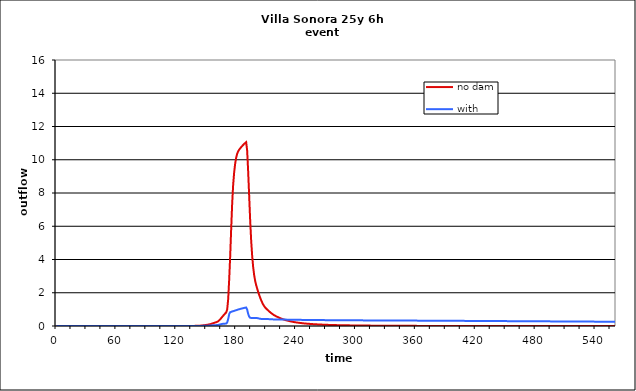
| Category | no dam | with dam |
|---|---|---|
| 0.0 | 0 | 0 |
| 1.0 | 0 | 0 |
| 2.0 | 0 | 0 |
| 3.0 | 0 | 0 |
| 4.0 | 0 | 0 |
| 5.0 | 0 | 0 |
| 6.0 | 0 | 0 |
| 7.0 | 0 | 0 |
| 8.0 | 0 | 0 |
| 9.0 | 0 | 0 |
| 10.0 | 0 | 0 |
| 11.0 | 0 | 0 |
| 12.0 | 0 | 0 |
| 13.0 | 0 | 0 |
| 14.0 | 0 | 0 |
| 15.0 | 0 | 0 |
| 16.0 | 0 | 0 |
| 17.0 | 0 | 0 |
| 18.0 | 0 | 0 |
| 19.0 | 0 | 0 |
| 20.0 | 0 | 0 |
| 21.0 | 0 | 0 |
| 22.0 | 0 | 0 |
| 23.0 | 0 | 0 |
| 24.0 | 0 | 0 |
| 25.0 | 0 | 0 |
| 26.0 | 0 | 0 |
| 27.0 | 0 | 0 |
| 28.0 | 0 | 0 |
| 29.0 | 0 | 0 |
| 30.0 | 0 | 0 |
| 31.0 | 0 | 0 |
| 32.0 | 0 | 0 |
| 33.0 | 0 | 0 |
| 34.0 | 0 | 0 |
| 35.0 | 0 | 0 |
| 36.0 | 0 | 0 |
| 37.0 | 0 | 0 |
| 38.0 | 0 | 0 |
| 39.0 | 0 | 0 |
| 40.0 | 0 | 0 |
| 41.0 | 0 | 0 |
| 42.0 | 0 | 0 |
| 43.0 | 0 | 0 |
| 44.0 | 0 | 0 |
| 45.0 | 0 | 0 |
| 46.0 | 0 | 0 |
| 47.0 | 0 | 0 |
| 48.0 | 0 | 0 |
| 49.0 | 0 | 0 |
| 50.0 | 0 | 0 |
| 51.0 | 0 | 0 |
| 52.0 | 0 | 0 |
| 53.0 | 0 | 0 |
| 54.0 | 0 | 0 |
| 55.0 | 0 | 0 |
| 56.0 | 0 | 0 |
| 57.0 | 0 | 0 |
| 58.0 | 0 | 0 |
| 59.0 | 0 | 0 |
| 60.0 | 0 | 0 |
| 61.0 | 0 | 0 |
| 62.0 | 0 | 0 |
| 63.0 | 0 | 0 |
| 64.0 | 0 | 0 |
| 65.0 | 0 | 0 |
| 66.0 | 0 | 0 |
| 67.0 | 0 | 0 |
| 68.0 | 0 | 0 |
| 69.0 | 0 | 0 |
| 70.0 | 0 | 0 |
| 71.0 | 0 | 0 |
| 72.0 | 0 | 0 |
| 73.0 | 0 | 0 |
| 74.0 | 0 | 0 |
| 75.0 | 0 | 0 |
| 76.0 | 0 | 0 |
| 77.0 | 0 | 0 |
| 78.0 | 0 | 0 |
| 79.0 | 0 | 0 |
| 80.0 | 0 | 0 |
| 81.0 | 0 | 0 |
| 82.0 | 0 | 0 |
| 83.0 | 0 | 0 |
| 84.0 | 0 | 0 |
| 85.0 | 0 | 0 |
| 86.0 | 0 | 0 |
| 87.0 | 0 | 0 |
| 88.0 | 0 | 0 |
| 89.0 | 0 | 0 |
| 90.0 | 0 | 0 |
| 91.0 | 0 | 0 |
| 92.0 | 0 | 0 |
| 93.0 | 0 | 0 |
| 94.0 | 0 | 0 |
| 95.0 | 0 | 0 |
| 96.0 | 0 | 0 |
| 97.0 | 0 | 0 |
| 98.0 | 0 | 0 |
| 99.0 | 0 | 0 |
| 100.0 | 0 | 0 |
| 101.0 | 0 | 0 |
| 102.0 | 0 | 0 |
| 103.0 | 0 | 0 |
| 104.0 | 0 | 0 |
| 105.0 | 0 | 0 |
| 106.0 | 0 | 0 |
| 107.0 | 0 | 0 |
| 108.0 | 0 | 0 |
| 109.0 | 0 | 0 |
| 110.0 | 0 | 0 |
| 111.0 | 0 | 0 |
| 112.0 | 0 | 0 |
| 113.0 | 0 | 0 |
| 114.0 | 0 | 0 |
| 115.0 | 0 | 0 |
| 116.0 | 0 | 0 |
| 117.0 | 0 | 0 |
| 118.0 | 0 | 0 |
| 119.0 | 0 | 0 |
| 120.0 | 0 | 0 |
| 121.0 | 0 | 0 |
| 122.0 | 0 | 0 |
| 123.0 | 0 | 0 |
| 124.0 | 0 | 0 |
| 125.0 | 0 | 0 |
| 126.0 | 0 | 0 |
| 127.0 | 0 | 0 |
| 128.0 | 0 | 0 |
| 129.0 | 0 | 0 |
| 130.0 | 0 | 0 |
| 131.0 | 0 | 0 |
| 132.0 | 0 | 0 |
| 133.0 | 0 | 0 |
| 134.0 | 0 | 0 |
| 135.0 | 0 | 0 |
| 136.0 | 0 | 0 |
| 137.0 | 0.001 | 0 |
| 138.0 | 0.006 | 0.001 |
| 139.0 | 0.009 | 0.001 |
| 140.0 | 0.01 | 0.001 |
| 141.0 | 0.012 | 0.002 |
| 142.0 | 0.014 | 0.002 |
| 143.0 | 0.017 | 0.003 |
| 144.0 | 0.021 | 0.004 |
| 145.0 | 0.026 | 0.005 |
| 146.0 | 0.032 | 0.007 |
| 147.0 | 0.04 | 0.009 |
| 148.0 | 0.048 | 0.012 |
| 149.0 | 0.057 | 0.014 |
| 150.0 | 0.065 | 0.016 |
| 151.0 | 0.073 | 0.018 |
| 152.0 | 0.083 | 0.02 |
| 153.0 | 0.095 | 0.024 |
| 154.0 | 0.11 | 0.028 |
| 155.0 | 0.13 | 0.033 |
| 156.0 | 0.151 | 0.037 |
| 157.0 | 0.171 | 0.042 |
| 158.0 | 0.19 | 0.046 |
| 159.0 | 0.209 | 0.049 |
| 160.0 | 0.227 | 0.052 |
| 161.0 | 0.25 | 0.056 |
| 162.0 | 0.283 | 0.066 |
| 163.0 | 0.331 | 0.079 |
| 164.0 | 0.399 | 0.096 |
| 165.0 | 0.474 | 0.113 |
| 166.0 | 0.547 | 0.126 |
| 167.0 | 0.619 | 0.134 |
| 168.0 | 0.689 | 0.139 |
| 169.0 | 0.756 | 0.143 |
| 170.0 | 0.818 | 0.146 |
| 171.0 | 0.994 | 0.213 |
| 172.0 | 1.619 | 0.423 |
| 173.0 | 2.797 | 0.709 |
| 174.0 | 4.209 | 0.829 |
| 175.0 | 5.847 | 0.855 |
| 176.0 | 7.383 | 0.874 |
| 177.0 | 8.508 | 0.892 |
| 178.0 | 9.254 | 0.911 |
| 179.0 | 9.768 | 0.93 |
| 180.0 | 10.128 | 0.951 |
| 181.0 | 10.358 | 0.971 |
| 182.0 | 10.506 | 0.991 |
| 183.0 | 10.605 | 1.009 |
| 184.0 | 10.684 | 1.026 |
| 185.0 | 10.755 | 1.042 |
| 186.0 | 10.824 | 1.058 |
| 187.0 | 10.891 | 1.073 |
| 188.0 | 10.953 | 1.087 |
| 189.0 | 11.009 | 1.1 |
| 190.0 | 11.056 | 1.113 |
| 191.0 | 10.547 | 0.988 |
| 192.0 | 9.304 | 0.736 |
| 193.0 | 7.849 | 0.565 |
| 194.0 | 6.383 | 0.496 |
| 195.0 | 5.162 | 0.477 |
| 196.0 | 4.237 | 0.476 |
| 197.0 | 3.555 | 0.479 |
| 198.0 | 3.07 | 0.483 |
| 199.0 | 2.72 | 0.486 |
| 200.0 | 2.462 | 0.488 |
| 201.0 | 2.256 | 0.483 |
| 202.0 | 2.059 | 0.465 |
| 203.0 | 1.877 | 0.446 |
| 204.0 | 1.71 | 0.432 |
| 205.0 | 1.557 | 0.425 |
| 206.0 | 1.419 | 0.422 |
| 207.0 | 1.299 | 0.422 |
| 208.0 | 1.198 | 0.423 |
| 209.0 | 1.116 | 0.423 |
| 210.0 | 1.05 | 0.424 |
| 211.0 | 0.993 | 0.423 |
| 212.0 | 0.937 | 0.417 |
| 213.0 | 0.882 | 0.41 |
| 214.0 | 0.829 | 0.405 |
| 215.0 | 0.779 | 0.401 |
| 216.0 | 0.733 | 0.399 |
| 217.0 | 0.69 | 0.398 |
| 218.0 | 0.651 | 0.398 |
| 219.0 | 0.616 | 0.398 |
| 220.0 | 0.585 | 0.398 |
| 221.0 | 0.557 | 0.398 |
| 222.0 | 0.529 | 0.395 |
| 223.0 | 0.502 | 0.392 |
| 224.0 | 0.474 | 0.389 |
| 225.0 | 0.449 | 0.387 |
| 226.0 | 0.425 | 0.385 |
| 227.0 | 0.402 | 0.384 |
| 228.0 | 0.382 | 0.384 |
| 229.0 | 0.364 | 0.384 |
| 230.0 | 0.347 | 0.384 |
| 231.0 | 0.331 | 0.383 |
| 232.0 | 0.316 | 0.382 |
| 233.0 | 0.302 | 0.38 |
| 234.0 | 0.287 | 0.378 |
| 235.0 | 0.273 | 0.377 |
| 236.0 | 0.26 | 0.376 |
| 237.0 | 0.247 | 0.375 |
| 238.0 | 0.236 | 0.374 |
| 239.0 | 0.226 | 0.374 |
| 240.0 | 0.217 | 0.374 |
| 241.0 | 0.209 | 0.373 |
| 242.0 | 0.2 | 0.372 |
| 243.0 | 0.193 | 0.371 |
| 244.0 | 0.185 | 0.37 |
| 245.0 | 0.177 | 0.369 |
| 246.0 | 0.169 | 0.368 |
| 247.0 | 0.162 | 0.367 |
| 248.0 | 0.156 | 0.366 |
| 249.0 | 0.15 | 0.366 |
| 250.0 | 0.145 | 0.365 |
| 251.0 | 0.14 | 0.365 |
| 252.0 | 0.135 | 0.364 |
| 253.0 | 0.13 | 0.363 |
| 254.0 | 0.126 | 0.362 |
| 255.0 | 0.121 | 0.362 |
| 256.0 | 0.117 | 0.361 |
| 257.0 | 0.112 | 0.36 |
| 258.0 | 0.108 | 0.36 |
| 259.0 | 0.105 | 0.359 |
| 260.0 | 0.101 | 0.359 |
| 261.0 | 0.098 | 0.358 |
| 262.0 | 0.095 | 0.358 |
| 263.0 | 0.092 | 0.357 |
| 264.0 | 0.089 | 0.356 |
| 265.0 | 0.086 | 0.355 |
| 266.0 | 0.083 | 0.355 |
| 267.0 | 0.08 | 0.354 |
| 268.0 | 0.078 | 0.354 |
| 269.0 | 0.075 | 0.353 |
| 270.0 | 0.073 | 0.353 |
| 271.0 | 0.07 | 0.352 |
| 272.0 | 0.068 | 0.352 |
| 273.0 | 0.066 | 0.351 |
| 274.0 | 0.064 | 0.35 |
| 275.0 | 0.062 | 0.35 |
| 276.0 | 0.06 | 0.349 |
| 277.0 | 0.058 | 0.349 |
| 278.0 | 0.057 | 0.349 |
| 279.0 | 0.055 | 0.348 |
| 280.0 | 0.053 | 0.348 |
| 281.0 | 0.052 | 0.347 |
| 282.0 | 0.05 | 0.347 |
| 283.0 | 0.049 | 0.347 |
| 284.0 | 0.048 | 0.346 |
| 285.0 | 0.047 | 0.346 |
| 286.0 | 0.046 | 0.345 |
| 287.0 | 0.044 | 0.345 |
| 288.0 | 0.043 | 0.345 |
| 289.0 | 0.042 | 0.344 |
| 290.0 | 0.041 | 0.344 |
| 291.0 | 0.04 | 0.344 |
| 292.0 | 0.039 | 0.343 |
| 293.0 | 0.038 | 0.343 |
| 294.0 | 0.037 | 0.342 |
| 295.0 | 0.036 | 0.342 |
| 296.0 | 0.036 | 0.342 |
| 297.0 | 0.035 | 0.341 |
| 298.0 | 0.034 | 0.341 |
| 299.0 | 0.033 | 0.341 |
| 300.0 | 0.032 | 0.34 |
| 301.0 | 0.031 | 0.34 |
| 302.0 | 0.03 | 0.34 |
| 303.0 | 0.03 | 0.339 |
| 304.0 | 0.029 | 0.339 |
| 305.0 | 0.028 | 0.339 |
| 306.0 | 0.027 | 0.339 |
| 307.0 | 0.027 | 0.338 |
| 308.0 | 0.026 | 0.338 |
| 309.0 | 0.025 | 0.338 |
| 310.0 | 0.025 | 0.337 |
| 311.0 | 0.024 | 0.337 |
| 312.0 | 0.024 | 0.337 |
| 313.0 | 0.023 | 0.337 |
| 314.0 | 0.023 | 0.336 |
| 315.0 | 0.022 | 0.336 |
| 316.0 | 0.022 | 0.336 |
| 317.0 | 0.021 | 0.336 |
| 318.0 | 0.021 | 0.335 |
| 319.0 | 0.02 | 0.335 |
| 320.0 | 0.02 | 0.335 |
| 321.0 | 0.019 | 0.334 |
| 322.0 | 0.019 | 0.334 |
| 323.0 | 0.019 | 0.334 |
| 324.0 | 0.018 | 0.334 |
| 325.0 | 0.018 | 0.333 |
| 326.0 | 0.017 | 0.333 |
| 327.0 | 0.017 | 0.333 |
| 328.0 | 0.017 | 0.333 |
| 329.0 | 0.016 | 0.332 |
| 330.0 | 0.016 | 0.332 |
| 331.0 | 0.016 | 0.332 |
| 332.0 | 0.015 | 0.331 |
| 333.0 | 0.015 | 0.331 |
| 334.0 | 0.014 | 0.331 |
| 335.0 | 0.014 | 0.331 |
| 336.0 | 0.014 | 0.33 |
| 337.0 | 0.013 | 0.33 |
| 338.0 | 0.013 | 0.33 |
| 339.0 | 0.013 | 0.33 |
| 340.0 | 0.013 | 0.329 |
| 341.0 | 0.012 | 0.329 |
| 342.0 | 0.012 | 0.329 |
| 343.0 | 0.012 | 0.328 |
| 344.0 | 0.011 | 0.328 |
| 345.0 | 0.011 | 0.328 |
| 346.0 | 0.011 | 0.328 |
| 347.0 | 0.011 | 0.327 |
| 348.0 | 0.01 | 0.327 |
| 349.0 | 0.01 | 0.327 |
| 350.0 | 0.01 | 0.326 |
| 351.0 | 0.01 | 0.326 |
| 352.0 | 0.009 | 0.326 |
| 353.0 | 0.009 | 0.326 |
| 354.0 | 0.009 | 0.325 |
| 355.0 | 0.009 | 0.325 |
| 356.0 | 0.008 | 0.325 |
| 357.0 | 0.008 | 0.324 |
| 358.0 | 0.008 | 0.324 |
| 359.0 | 0.008 | 0.324 |
| 360.0 | 0.008 | 0.324 |
| 361.0 | 0.007 | 0.323 |
| 362.0 | 0.007 | 0.323 |
| 363.0 | 0.007 | 0.323 |
| 364.0 | 0.007 | 0.322 |
| 365.0 | 0.007 | 0.322 |
| 366.0 | 0.006 | 0.322 |
| 367.0 | 0.006 | 0.322 |
| 368.0 | 0.006 | 0.321 |
| 369.0 | 0.006 | 0.321 |
| 370.0 | 0.006 | 0.321 |
| 371.0 | 0.006 | 0.32 |
| 372.0 | 0.005 | 0.32 |
| 373.0 | 0.005 | 0.32 |
| 374.0 | 0.005 | 0.32 |
| 375.0 | 0.004 | 0.319 |
| 376.0 | 0.004 | 0.319 |
| 377.0 | 0.004 | 0.319 |
| 378.0 | 0.004 | 0.318 |
| 379.0 | 0.003 | 0.318 |
| 380.0 | 0.003 | 0.318 |
| 381.0 | 0.003 | 0.318 |
| 382.0 | 0.002 | 0.317 |
| 383.0 | 0.002 | 0.317 |
| 384.0 | 0.002 | 0.317 |
| 385.0 | 0.002 | 0.316 |
| 386.0 | 0.001 | 0.316 |
| 387.0 | 0.001 | 0.316 |
| 388.0 | 0.001 | 0.315 |
| 389.0 | 0.001 | 0.315 |
| 390.0 | 0.001 | 0.315 |
| 391.0 | 0.001 | 0.314 |
| 392.0 | 0.001 | 0.314 |
| 393.0 | 0.001 | 0.314 |
| 394.0 | 0.001 | 0.313 |
| 395.0 | 0.001 | 0.313 |
| 396.0 | 0 | 0.313 |
| 397.0 | 0 | 0.312 |
| 398.0 | 0 | 0.312 |
| 399.0 | 0 | 0.312 |
| 400.0 | 0 | 0.311 |
| 401.0 | 0 | 0.311 |
| 402.0 | 0 | 0.31 |
| 403.0 | 0 | 0.31 |
| 404.0 | 0 | 0.31 |
| 405.0 | 0 | 0.309 |
| 406.0 | 0 | 0.309 |
| 407.0 | 0 | 0.309 |
| 408.0 | 0 | 0.308 |
| 409.0 | 0 | 0.308 |
| 410.0 | 0 | 0.308 |
| 411.0 | 0 | 0.307 |
| 412.0 | 0 | 0.307 |
| 413.0 | 0 | 0.307 |
| 414.0 | 0 | 0.306 |
| 415.0 | 0 | 0.306 |
| 416.0 | 0 | 0.306 |
| 417.0 | 0 | 0.305 |
| 418.0 | 0 | 0.305 |
| 419.0 | 0 | 0.304 |
| 420.0 | 0 | 0.304 |
| 421.0 | 0 | 0.304 |
| 422.0 | 0 | 0.303 |
| 423.0 | 0 | 0.303 |
| 424.0 | 0 | 0.303 |
| 425.0 | 0 | 0.302 |
| 426.0 | 0 | 0.302 |
| 427.0 | 0 | 0.302 |
| 428.0 | 0 | 0.301 |
| 429.0 | 0 | 0.301 |
| 430.0 | 0 | 0.301 |
| 431.0 | 0 | 0.3 |
| 432.0 | 0 | 0.3 |
| 433.0 | 0 | 0.3 |
| 434.0 | 0 | 0.299 |
| 435.0 | 0 | 0.299 |
| 436.0 | 0 | 0.299 |
| 437.0 | 0 | 0.298 |
| 438.0 | 0 | 0.298 |
| 439.0 | 0 | 0.297 |
| 440.0 | 0 | 0.297 |
| 441.0 | 0 | 0.297 |
| 442.0 | 0 | 0.296 |
| 443.0 | 0 | 0.296 |
| 444.0 | 0 | 0.296 |
| 445.0 | 0 | 0.295 |
| 446.0 | 0 | 0.295 |
| 447.0 | 0 | 0.295 |
| 448.0 | 0 | 0.294 |
| 449.0 | 0 | 0.294 |
| 450.0 | 0 | 0.294 |
| 451.0 | 0 | 0.293 |
| 452.0 | 0 | 0.293 |
| 453.0 | 0 | 0.293 |
| 454.0 | 0 | 0.292 |
| 455.0 | 0 | 0.292 |
| 456.0 | 0 | 0.292 |
| 457.0 | 0 | 0.291 |
| 458.0 | 0 | 0.291 |
| 459.0 | 0 | 0.29 |
| 460.0 | 0 | 0.29 |
| 461.0 | 0 | 0.29 |
| 462.0 | 0 | 0.289 |
| 463.0 | 0 | 0.289 |
| 464.0 | 0 | 0.289 |
| 465.0 | 0 | 0.288 |
| 466.0 | 0 | 0.288 |
| 467.0 | 0 | 0.288 |
| 468.0 | 0 | 0.287 |
| 469.0 | 0 | 0.287 |
| 470.0 | 0 | 0.287 |
| 471.0 | 0 | 0.286 |
| 472.0 | 0 | 0.286 |
| 473.0 | 0 | 0.286 |
| 474.0 | 0 | 0.285 |
| 475.0 | 0 | 0.285 |
| 476.0 | 0 | 0.285 |
| 477.0 | 0 | 0.284 |
| 478.0 | 0 | 0.284 |
| 479.0 | 0 | 0.284 |
| 480.0 | 0 | 0.283 |
| 481.0 | 0 | 0.283 |
| 482.0 | 0 | 0.282 |
| 483.0 | 0 | 0.282 |
| 484.0 | 0 | 0.282 |
| 485.0 | 0 | 0.281 |
| 486.0 | 0 | 0.281 |
| 487.0 | 0 | 0.281 |
| 488.0 | 0 | 0.28 |
| 489.0 | 0 | 0.28 |
| 490.0 | 0 | 0.28 |
| 491.0 | 0 | 0.279 |
| 492.0 | 0 | 0.279 |
| 493.0 | 0 | 0.279 |
| 494.0 | 0 | 0.278 |
| 495.0 | 0 | 0.278 |
| 496.0 | 0 | 0.278 |
| 497.0 | 0 | 0.277 |
| 498.0 | 0 | 0.277 |
| 499.0 | 0 | 0.277 |
| 500.0 | 0 | 0.276 |
| 501.0 | 0 | 0.276 |
| 502.0 | 0 | 0.276 |
| 503.0 | 0 | 0.275 |
| 504.0 | 0 | 0.275 |
| 505.0 | 0 | 0.275 |
| 506.0 | 0 | 0.274 |
| 507.0 | 0 | 0.274 |
| 508.0 | 0 | 0.274 |
| 509.0 | 0 | 0.273 |
| 510.0 | 0 | 0.273 |
| 511.0 | 0 | 0.273 |
| 512.0 | 0 | 0.272 |
| 513.0 | 0 | 0.272 |
| 514.0 | 0 | 0.271 |
| 515.0 | 0 | 0.271 |
| 516.0 | 0 | 0.271 |
| 517.0 | 0 | 0.27 |
| 518.0 | 0 | 0.27 |
| 519.0 | 0 | 0.27 |
| 520.0 | 0 | 0.269 |
| 521.0 | 0 | 0.269 |
| 522.0 | 0 | 0.269 |
| 523.0 | 0 | 0.268 |
| 524.0 | 0 | 0.268 |
| 525.0 | 0 | 0.268 |
| 526.0 | 0 | 0.267 |
| 527.0 | 0 | 0.267 |
| 528.0 | 0 | 0.267 |
| 529.0 | 0 | 0.266 |
| 530.0 | 0 | 0.266 |
| 531.0 | 0 | 0.266 |
| 532.0 | 0 | 0.265 |
| 533.0 | 0 | 0.265 |
| 534.0 | 0 | 0.265 |
| 535.0 | 0 | 0.264 |
| 536.0 | 0 | 0.264 |
| 537.0 | 0 | 0.264 |
| 538.0 | 0 | 0.263 |
| 539.0 | 0 | 0.263 |
| 540.0 | 0 | 0.263 |
| 541.0 | 0 | 0.262 |
| 542.0 | 0 | 0.262 |
| 543.0 | 0 | 0.262 |
| 544.0 | 0 | 0.261 |
| 545.0 | 0 | 0.261 |
| 546.0 | 0 | 0.261 |
| 547.0 | 0 | 0.26 |
| 548.0 | 0 | 0.26 |
| 549.0 | 0 | 0.26 |
| 550.0 | 0 | 0.259 |
| 551.0 | 0 | 0.259 |
| 552.0 | 0 | 0.258 |
| 553.0 | 0 | 0.258 |
| 554.0 | 0 | 0.258 |
| 555.0 | 0 | 0.257 |
| 556.0 | 0 | 0.257 |
| 557.0 | 0 | 0.257 |
| 558.0 | 0 | 0.256 |
| 559.0 | 0 | 0.256 |
| 560.0 | 0 | 0.256 |